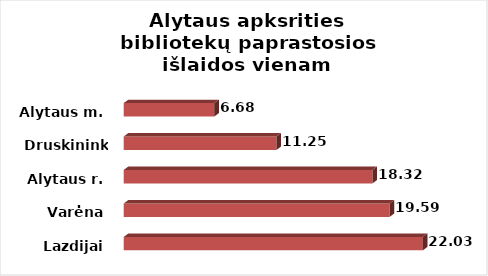
| Category | Series 0 |
|---|---|
| Lazdijai | 22.032 |
| Varėna | 19.59 |
| Alytaus r. | 18.321 |
| Druskininkai | 11.251 |
| Alytaus m. | 6.677 |